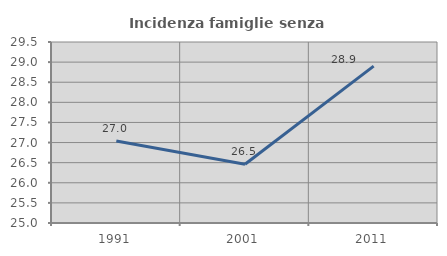
| Category | Incidenza famiglie senza nuclei |
|---|---|
| 1991.0 | 27.036 |
| 2001.0 | 26.462 |
| 2011.0 | 28.901 |